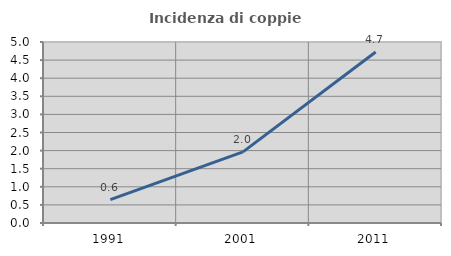
| Category | Incidenza di coppie miste |
|---|---|
| 1991.0 | 0.645 |
| 2001.0 | 1.965 |
| 2011.0 | 4.724 |